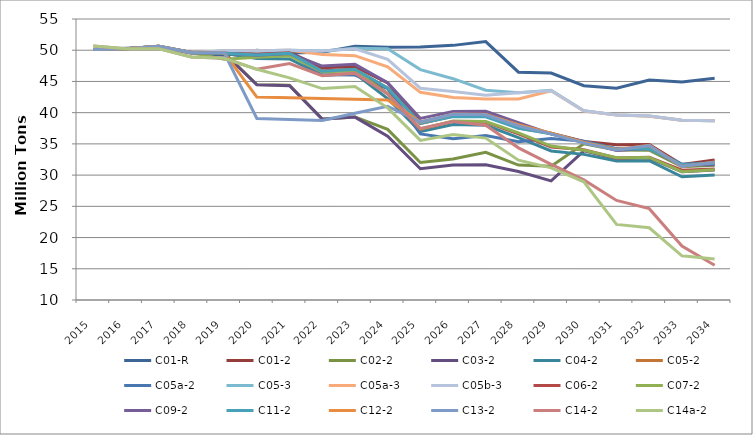
| Category | C01-R | C01-2 | C02-2 | C03-2 | C04-2 | C05-2 | C05a-2 | C05-3 | C05a-3 | C05b-3 | C06-2 | C07-2 | C09-2 | C11-2 | C12-2 | C13-2 | C14-2 | C14a-2 |
|---|---|---|---|---|---|---|---|---|---|---|---|---|---|---|---|---|---|---|
| 2015.0 | 50.118 | 50.118 | 50.118 | 50.119 | 50.119 | 50.119 | 50.117 | 50.119 | 50.118 | 50.118 | 50.119 | 50.119 | 50.112 | 50.119 | 50.118 | 50.118 | 50.685 | 50.685 |
| 2016.0 | 50.329 | 50.238 | 50.238 | 50.239 | 50.239 | 50.239 | 50.238 | 50.239 | 50.238 | 50.239 | 50.239 | 50.239 | 50.225 | 50.228 | 50.238 | 50.238 | 50.242 | 50.242 |
| 2017.0 | 50.499 | 50.622 | 50.622 | 50.593 | 50.589 | 50.623 | 50.622 | 50.623 | 50.622 | 50.623 | 50.588 | 50.593 | 50.601 | 50.598 | 50.622 | 50.622 | 50.249 | 50.248 |
| 2018.0 | 49.555 | 49.636 | 49.62 | 49.559 | 49.559 | 49.637 | 49.62 | 49.556 | 49.552 | 49.556 | 49.579 | 49.579 | 49.612 | 49.599 | 49.62 | 49.62 | 48.91 | 48.908 |
| 2019.0 | 49.181 | 49.421 | 49.587 | 49.523 | 49.494 | 49.592 | 49.608 | 49.9 | 49.894 | 49.9 | 49.527 | 48.545 | 49.523 | 49.525 | 49.588 | 49.587 | 48.71 | 48.708 |
| 2020.0 | 49.976 | 48.938 | 44.51 | 44.472 | 48.68 | 49.245 | 49.392 | 49.922 | 49.913 | 49.924 | 49.352 | 48.867 | 49.212 | 49.223 | 42.494 | 39.07 | 46.941 | 46.954 |
| 2021.0 | 49.548 | 49.665 | 44.389 | 44.321 | 48.605 | 49.5 | 49.519 | 50.013 | 50.013 | 50.013 | 49.573 | 49.127 | 49.468 | 49.527 | 42.376 | 38.907 | 47.87 | 45.567 |
| 2022.0 | 49.671 | 47.203 | 38.984 | 38.96 | 45.99 | 46.628 | 46.059 | 49.872 | 49.312 | 49.871 | 46.655 | 46.519 | 47.465 | 46.639 | 42.259 | 38.735 | 45.933 | 43.854 |
| 2023.0 | 50.618 | 47.383 | 39.321 | 39.286 | 46.281 | 46.908 | 46.019 | 50.303 | 49.132 | 50.242 | 46.956 | 46.702 | 47.74 | 46.953 | 42.141 | 39.908 | 46.328 | 44.177 |
| 2024.0 | 50.491 | 44.746 | 37.322 | 36.214 | 42.261 | 43.917 | 43.855 | 50.252 | 47.347 | 48.546 | 43.05 | 43.019 | 44.782 | 43.964 | 42.024 | 41.01 | 42.978 | 40.775 |
| 2025.0 | 50.508 | 38.519 | 32.024 | 31.012 | 36.967 | 38.246 | 36.593 | 46.893 | 43.259 | 43.912 | 37.334 | 37.357 | 39.07 | 38.301 | 38.489 | 38.5 | 37.451 | 35.56 |
| 2026.0 | 50.777 | 39.539 | 32.578 | 31.624 | 38.112 | 39.416 | 35.817 | 45.442 | 42.413 | 43.392 | 38.605 | 38.667 | 40.179 | 39.381 | 39.786 | 39.733 | 38.571 | 36.493 |
| 2027.0 | 51.38 | 39.462 | 33.654 | 31.654 | 37.987 | 40.111 | 36.332 | 43.605 | 42.177 | 42.809 | 38.483 | 38.589 | 40.238 | 39.336 | 39.697 | 39.66 | 37.998 | 35.922 |
| 2028.0 | 46.481 | 37.785 | 31.605 | 30.585 | 35.989 | 37.537 | 35.333 | 43.189 | 42.179 | 43.171 | 36.603 | 36.754 | 38.399 | 37.513 | 38.08 | 37.865 | 34.368 | 32.393 |
| 2029.0 | 46.342 | 36.715 | 31.43 | 29.075 | 33.863 | 36.65 | 35.879 | 43.594 | 43.503 | 43.52 | 34.487 | 34.648 | 36.579 | 36.628 | 36.702 | 36.61 | 31.71 | 31.158 |
| 2030.0 | 44.317 | 35.397 | 35.013 | 33.898 | 33.323 | 35.303 | 35.407 | 40.299 | 40.272 | 40.299 | 34.057 | 33.967 | 35.357 | 35.27 | 35.233 | 35.12 | 29.228 | 28.931 |
| 2031.0 | 43.901 | 34.881 | 34.024 | 32.639 | 32.273 | 34.199 | 34.218 | 39.646 | 39.619 | 39.643 | 32.739 | 32.789 | 33.924 | 34.193 | 34.119 | 34.013 | 25.947 | 22.1 |
| 2032.0 | 45.215 | 34.915 | 33.979 | 32.738 | 32.314 | 34.193 | 34.241 | 39.467 | 39.44 | 39.475 | 32.852 | 32.827 | 34.316 | 34.203 | 34.754 | 34.748 | 24.628 | 21.57 |
| 2033.0 | 44.915 | 31.713 | 31.354 | 30.55 | 29.722 | 31.624 | 31.759 | 38.804 | 38.785 | 38.801 | 30.796 | 30.553 | 31.622 | 31.665 | 31.394 | 31.382 | 18.632 | 17.075 |
| 2034.0 | 45.496 | 32.435 | 31.563 | 30.799 | 30.029 | 31.836 | 31.985 | 38.707 | 38.699 | 38.705 | 30.959 | 30.849 | 31.65 | 31.872 | 32.084 | 32.067 | 15.571 | 16.572 |